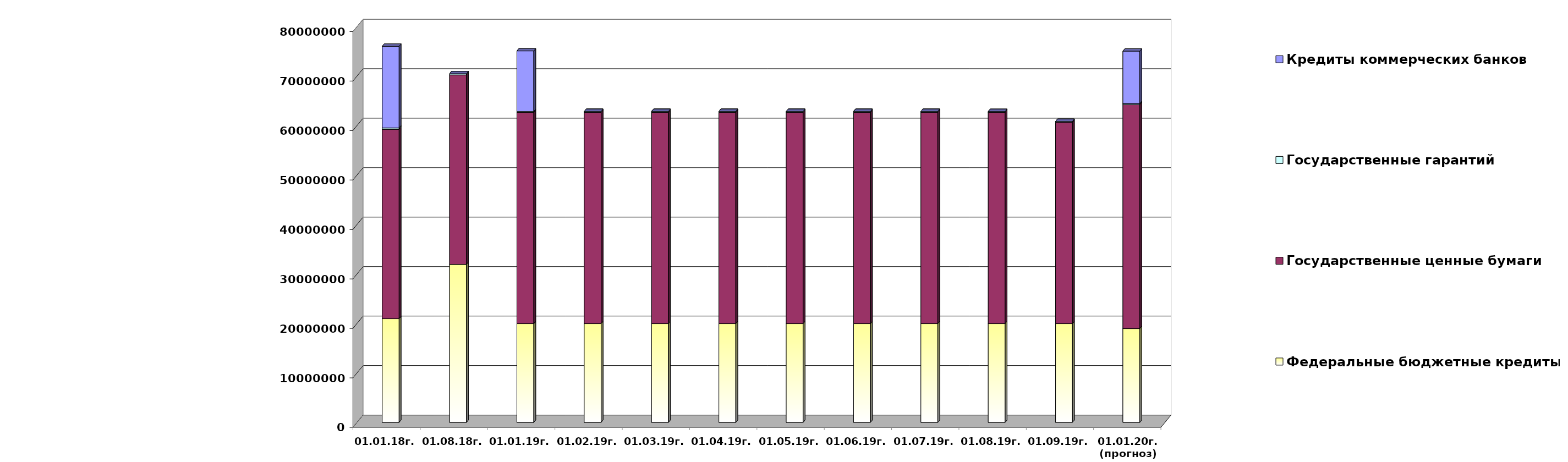
| Category | Федеральные бюджетные кредиты | Государственные ценные бумаги  | Государственные гарантий | Кредиты коммерческих банков |
|---|---|---|---|---|
| 01.01.18г. | 20959084.963 | 38300000 | 267412.82 | 16500000 |
| 01.08.18г. | 31945227.963 | 38300000 | 232477.01 | 0 |
| 01.01.19г. | 19957026.213 | 42700000 | 209872.86 | 12219963.75 |
| 01.02.19г. | 19957026.213 | 42700000 | 200735.86 | 0 |
| 01.03.19г. | 19957026.213 | 42700000 | 200735.86 | 0 |
| 01.04.19г. | 19957026.213 | 42700000 | 200735.86 | 0 |
| 01.05.19г. | 19957026.213 | 42700000 | 200735.86 | 0 |
| 01.06.19г. | 19957026.213 | 42700000 | 200735.86 | 0 |
| 01.07.19г. | 19957026.213 | 42700000 | 200735.86 | 0 |
| 01.08.19г. | 19957026.213 | 42700000 | 187793.375 | 0 |
| 01.09.19г. | 19957026.213 | 40700000 | 187793.375 | 0 |
| 01.01.20г.
(прогноз) | 18954967.4 | 45300000 | 176330 | 10616393.4 |